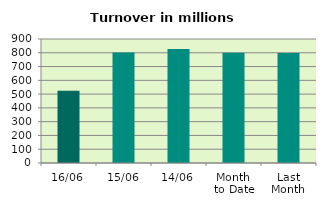
| Category | Series 0 |
|---|---|
| 16/06 | 525.166 |
| 15/06 | 801.129 |
| 14/06 | 827.585 |
| Month 
to Date | 799.901 |
| Last
Month | 798.504 |